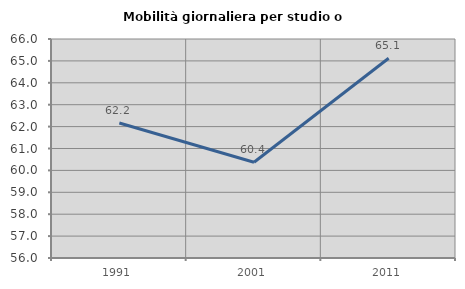
| Category | Mobilità giornaliera per studio o lavoro |
|---|---|
| 1991.0 | 62.162 |
| 2001.0 | 60.37 |
| 2011.0 | 65.121 |